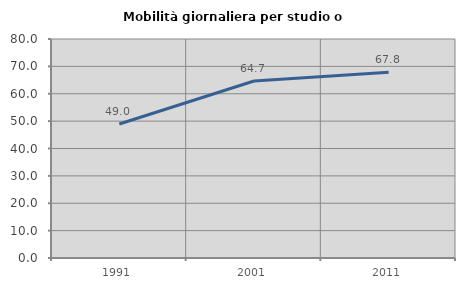
| Category | Mobilità giornaliera per studio o lavoro |
|---|---|
| 1991.0 | 48.966 |
| 2001.0 | 64.663 |
| 2011.0 | 67.828 |